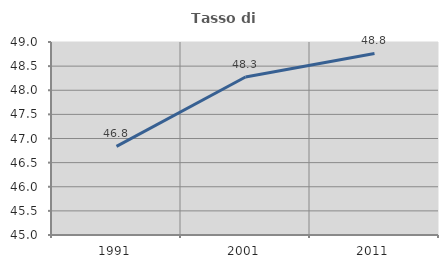
| Category | Tasso di occupazione   |
|---|---|
| 1991.0 | 46.837 |
| 2001.0 | 48.274 |
| 2011.0 | 48.763 |